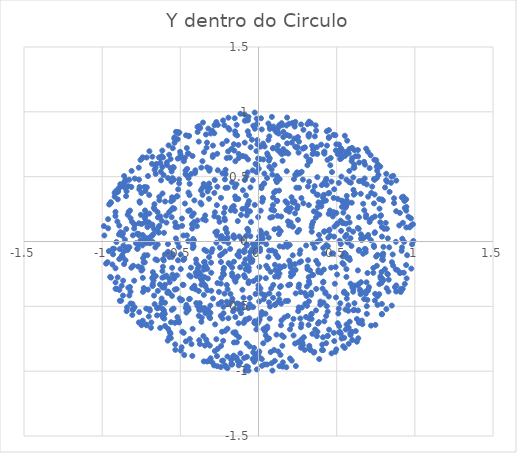
| Category | Y dentro do Circulo |
|---|---|
| 0.0 | 0 |
| 0.5824913958309657 | 0.147 |
| -0.10274675420012946 | -0.372 |
| 0.3691181538297885 | -0.149 |
| 0.28324670696125986 | -0.799 |
| -0.22171421234348498 | 0.003 |
| 0.34918489653656937 | 0.389 |
| -0.17051188895530744 | -0.459 |
| 0.0 | 0 |
| -0.2822801752314581 | 0.375 |
| 0.0 | 0 |
| -0.8305976686521073 | 0.227 |
| -0.8409951767035069 | -0.507 |
| -0.807322820931881 | -0.567 |
| 0.32517920160419833 | -0.822 |
| 0.3483666643932861 | 0.15 |
| 0.18859269846408022 | 0.155 |
| 0.41249743487753876 | -0.739 |
| -0.7141899433687766 | 0.418 |
| 0.0 | 0 |
| 0.3759309111390634 | 0.675 |
| 0.0 | 0 |
| 0.6491729342163812 | -0.372 |
| -0.08356164736692451 | -0.138 |
| 0.0 | 0 |
| 0.0 | 0 |
| 0.48222065649139334 | -0.704 |
| 0.6133080096440979 | 0.569 |
| 0.0 | 0 |
| 0.2035934603628089 | -0.182 |
| -0.5369673955765399 | 0.804 |
| 0.8786831464304732 | -0.002 |
| 0.0 | 0 |
| 0.2591799225699525 | 0.77 |
| -0.013596083525351244 | -0.678 |
| 0.5504688796966977 | -0.089 |
| -0.12651882503492629 | 0.644 |
| 0.0 | 0 |
| 0.11070303346926358 | -0.098 |
| -0.07887533704441974 | 0.043 |
| -0.3742973551315738 | -0.51 |
| -0.4843319749107293 | -0.334 |
| 0.0725126760214021 | 0.868 |
| -0.07067640993851287 | 0.098 |
| 0.5370403599780624 | -0.166 |
| 0.605317040131907 | 0.076 |
| -0.12514234186607442 | -0.738 |
| -0.08646866079407567 | -0.275 |
| 0.0 | 0 |
| 0.0 | 0 |
| 0.38011067176742674 | 0.36 |
| 0.0 | 0 |
| 0.0 | 0 |
| 0.8503405297641415 | 0.5 |
| 0.0 | 0 |
| 0.774221274463414 | 0.253 |
| -0.3162615292680615 | -0.12 |
| -0.48768610515749744 | -0.696 |
| -0.9549618778805946 | 0.285 |
| -0.3579383095247284 | 0.36 |
| -0.5499325939312683 | -0.255 |
| -0.5327327922374776 | -0.793 |
| -0.3388243723242108 | -0.553 |
| 0.6434961169008853 | -0.326 |
| 0.10183523932162242 | 0.095 |
| -0.5627692674530562 | -0.71 |
| -0.6340711962837107 | 0.122 |
| 0.15835578605192557 | 0.712 |
| -0.025094971917935638 | -0.08 |
| 0.0 | 0 |
| -0.9487728963605064 | -0.273 |
| 0.6853964652447091 | -0.061 |
| 0.337240819925559 | 0.911 |
| 0.0 | 0 |
| -0.7928095482513646 | -0.507 |
| -0.2926758793260462 | 0.652 |
| -0.6639568523584924 | 0.248 |
| -0.5971916382437978 | 0.308 |
| 0.0 | 0 |
| -0.15849107907487747 | 0.274 |
| 0.007335839017932777 | -0.895 |
| 0.0 | 0 |
| -0.7543966712906305 | 0.629 |
| -0.84393747633777 | 0.387 |
| -0.10287083286972387 | 0.252 |
| 0.0 | 0 |
| -0.6434490514446245 | 0.186 |
| 0.1392276410030775 | 0.686 |
| 0.027044977451173846 | 0.024 |
| 0.48063971328940847 | 0.336 |
| -0.32096948367387856 | 0.871 |
| 0.5264749523966377 | -0.019 |
| -0.679641614383711 | 0.045 |
| 0.0 | 0 |
| 0.06955037132103636 | -0.401 |
| 0.6765241224971563 | 0.241 |
| 0.7628542961505342 | 0.595 |
| 0.24908498842640525 | 0.073 |
| -0.6144139100303507 | -0.354 |
| 0.9223219745454649 | -0.365 |
| 0.3246211734815636 | 0.83 |
| 0.0 | 0 |
| 0.5193859741150035 | 0.707 |
| 0.28732604027799913 | 0.862 |
| 0.25016039747670815 | 0.274 |
| -0.02397805202246972 | 0.282 |
| -0.06164986680811246 | 0.312 |
| 0.9672042898750175 | 0.11 |
| -0.6225131078402659 | 0.647 |
| 0.49779177937294516 | 0.749 |
| -0.056129465928743016 | -0.436 |
| 0.7523059521893796 | -0.116 |
| -0.5607057680837213 | -0.745 |
| 0.4019824148962772 | 0.271 |
| -0.6112983400584597 | -0.587 |
| 0.0 | 0 |
| -0.6682483755685384 | -0.417 |
| 0.0 | 0 |
| 0.6070887278583763 | 0.398 |
| 0.0 | 0 |
| -0.46722693092133905 | 0.52 |
| 0.12222496752826828 | 0.198 |
| -0.3227080197566423 | -0.526 |
| -0.644663355965515 | -0.023 |
| -0.8185900556492052 | -0.478 |
| 0.23706140394374398 | -0.219 |
| 0.0065282399922172996 | -0.604 |
| -0.2399216684978842 | 0.337 |
| 0.931393501804419 | -0.003 |
| -0.8187582792241554 | -0.387 |
| 0.9095538126255538 | -0.365 |
| 0.3213492444182797 | 0.622 |
| -0.03455759665608826 | -0.506 |
| -0.24049605730190038 | 0.019 |
| 0.3392455855923253 | -0.597 |
| -0.6884425320386056 | 0.039 |
| 0.0 | 0 |
| -0.9434504935046404 | -0.279 |
| 0.0 | 0 |
| 0.0 | 0 |
| 0.5998275015271133 | -0.76 |
| 0.0 | 0 |
| 0.13519273978273816 | 0.481 |
| 0.12052299914682107 | 0.852 |
| 0.9779735240312586 | 0.124 |
| 0.09918770123905762 | 0.377 |
| 0.0 | 0 |
| 0.3288674930298563 | 0.618 |
| 0.0 | 0 |
| -0.9001491364631893 | 0.325 |
| -0.18537386581072024 | 0.863 |
| -0.23995120559009697 | -0.158 |
| 0.451535298446041 | -0.68 |
| -0.196624817689794 | 0.03 |
| 0.6886809534170801 | 0.716 |
| 0.0 | 0 |
| 0.0 | 0 |
| 0.24442729332645574 | 0.723 |
| 0.6911699122497048 | -0.315 |
| -0.26408078939681534 | 0.677 |
| 0.0671436912845973 | -0.47 |
| 0.6428291871940137 | -0.627 |
| -0.2692355782676239 | -0.009 |
| -0.31139358364841807 | -0.803 |
| 0.12802554547599998 | 0.879 |
| 0.5645171030428493 | 0.352 |
| 0.34202270434055726 | 0.131 |
| 0.0 | 0 |
| -0.018605640688908798 | -0.405 |
| -0.508479818435418 | -0.041 |
| 0.0 | 0 |
| 0.5607188551289555 | 0.27 |
| 0.0 | 0 |
| 0.7392888823988266 | -0.042 |
| 0.7912500699481027 | -0.291 |
| 0.14347353402208074 | -0.201 |
| 0.1901328270645204 | -0.337 |
| 0.0 | 0 |
| -0.2264643220439313 | 0.934 |
| -0.10397407882778542 | -0.486 |
| 0.0 | 0 |
| 0.5161769654218562 | -0.652 |
| -0.714838778170577 | 0.026 |
| 0.0 | 0 |
| -0.5781639886121681 | -0.674 |
| 0.0 | 0 |
| -0.07442731055949325 | -0.032 |
| -0.5625485123772633 | 0.566 |
| 0.018010504024617013 | 0.425 |
| 0.6556528250006752 | -0.314 |
| -0.2829043765458894 | 0.835 |
| 0.1906918157322941 | 0.257 |
| 0.5946525438108017 | -0.035 |
| 0.0 | 0 |
| -0.24935849936521115 | 0.152 |
| 0.13384458981056313 | -0.191 |
| -0.1624010349360634 | -0.538 |
| 0.2594673143501689 | 0.415 |
| -0.35723300157250315 | 0.417 |
| 0.0 | 0 |
| -0.6732113250777163 | 0.056 |
| 0.10431770209608238 | -0.921 |
| 0.36245919303719165 | -0.678 |
| -0.23347280489787114 | -0.696 |
| 0.7445196958170881 | -0.455 |
| -0.13976427917595502 | 0.9 |
| 0.5501256382620054 | 0.297 |
| 0.0 | 0 |
| 0.5766420871084792 | -0.665 |
| 0.6144220996514456 | -0.34 |
| -0.4194581313955146 | -0.021 |
| 0.4839990497905635 | 0.403 |
| 0.0 | 0 |
| -0.9202188721372699 | 0.346 |
| 0.0 | 0 |
| -0.011689824209191624 | 0.948 |
| -0.12268185255907538 | 0.039 |
| 0.22830328036528713 | 0.3 |
| -0.9304335420511718 | -0.099 |
| 0.7887476707398404 | 0.324 |
| 0.05578128912235103 | 0.679 |
| -0.22430116760598873 | -0.217 |
| -0.580737151648199 | -0.765 |
| 0.0 | 0 |
| -0.2946853378801346 | -0.059 |
| 0.2705757992186051 | -0.39 |
| 0.0 | 0 |
| -0.5483033725637936 | 0.719 |
| -0.2309277340627165 | 0.526 |
| 0.26763823163209755 | -0.068 |
| -0.3496991548153281 | -0.925 |
| -0.6603822474589898 | 0.59 |
| 0.0 | 0 |
| -0.0698644378154134 | 0.233 |
| 0.3737069653313092 | -0.73 |
| 0.450553515396368 | 0.859 |
| 0.0 | 0 |
| -0.2968110670327857 | 0.855 |
| 0.06281954808112844 | -0.119 |
| 0.0 | 0 |
| 0.017060272858139935 | -0.568 |
| 0.0 | 0 |
| 0.054826416026197755 | -0.948 |
| -0.07549742641571888 | 0.201 |
| -0.478311113203332 | -0.704 |
| 0.3803870880035145 | -0.632 |
| -0.5554818626110618 | 0.54 |
| 0.2900805465123837 | -0.738 |
| 0.06649458621219528 | 0.623 |
| 0.6757269296818118 | -0.444 |
| 0.0 | 0 |
| 0.2639261775617223 | 0.525 |
| -0.5165326708203313 | 0.639 |
| 0.10495543217363124 | -0.18 |
| 0.3214107423599455 | 0.809 |
| -0.49671073332258664 | 0.651 |
| 0.0 | 0 |
| -0.6943480946299625 | -0.013 |
| -0.4708747324666209 | 0.645 |
| 0.5458575157610892 | -0.394 |
| 0.08562373009985147 | 0.961 |
| 0.0 | 0 |
| 0.3686443207582488 | 0.855 |
| 0.0 | 0 |
| 0.22986935191350089 | 0.309 |
| 0.0 | 0 |
| -0.7488652462294276 | -0.224 |
| 0.07759778563582631 | -0.234 |
| 0.224346072792458 | -0.223 |
| 0.8198929346093782 | -0.361 |
| -0.9202124546339121 | 0.375 |
| 0.2079567493694925 | 0.257 |
| -0.026810369041211368 | -0.928 |
| -0.06431430367879942 | 0.961 |
| -0.19809822876411576 | -0.673 |
| 0.0 | 0 |
| 0.4190575745657501 | 0.446 |
| -0.6716309753937462 | -0.269 |
| 0.727444432194251 | 0.423 |
| 0.4281005063936456 | -0.4 |
| 0.0 | 0 |
| 0.7344931720199659 | -0.242 |
| 0.915600670959843 | -0.072 |
| 0.20509395053335688 | -0.169 |
| 0.1727975273506297 | 0.31 |
| -0.2176779495979173 | 0.179 |
| -0.497423015775468 | -0.842 |
| 0.0 | 0 |
| 0.0 | 0 |
| 0.07524499944177232 | 0.184 |
| 0.7371065584287153 | -0.03 |
| 0.9460015939803528 | 0.267 |
| -0.4127672460320151 | 0.008 |
| -0.052007279152955554 | 0.04 |
| 0.6381902579454499 | -0.746 |
| 0.5160086455489594 | -0.701 |
| 0.18258281063282777 | 0.821 |
| -0.46452640796397393 | -0.77 |
| 0.5419626638884651 | -0.111 |
| -0.8659261820476392 | -0.302 |
| -0.028636277071916405 | -0.821 |
| 0.037573366952292186 | 0.524 |
| -0.018822262862190353 | 0.599 |
| 0.0 | 0 |
| 0.0 | 0 |
| -0.06797983374595762 | -0.967 |
| 0.5426676343579451 | 0.223 |
| 0.2269011609570597 | 0.481 |
| -0.8547575150830544 | 0.014 |
| -0.17282585071317902 | 0.715 |
| -0.03673315877145722 | -0.018 |
| 0.8213577180703591 | 0.098 |
| -0.30615980941740295 | 0.833 |
| -0.12660555957938446 | -0.955 |
| 0.0 | 0 |
| 0.4523563187174098 | 0.374 |
| 0.9345296316271341 | 0.313 |
| 0.5074685786038788 | 0.329 |
| 0.0 | 0 |
| 0.1239298548704475 | 0.741 |
| 0.7344037586584227 | -0.204 |
| 0.7427958585964567 | 0.362 |
| 0.8524254471968253 | -0.494 |
| 0.0 | 0 |
| 0.0 | 0 |
| 0.5633229943393006 | -0.64 |
| -0.17738671148250895 | 0.24 |
| -0.30803366184432335 | -0.494 |
| 0.49321984940471353 | -0.197 |
| 0.060309910490006 | 0.663 |
| -0.8874559105107824 | -0.059 |
| 0.0 | 0 |
| -0.1270927268009543 | -0.482 |
| 0.04618118730545451 | -0.724 |
| 0.0 | 0 |
| 0.45433612602059004 | 0.091 |
| 0.0 | 0 |
| 0.0 | 0 |
| -0.22691173068752546 | -0.246 |
| -0.5325146382619739 | 0.146 |
| 0.09458126631659902 | -0.335 |
| -0.13587034885404958 | -0.478 |
| 0.0 | 0 |
| -0.6875923388386644 | -0.665 |
| 0.42076148062109686 | 0.075 |
| -0.7481302461303698 | -0.646 |
| 0.0 | 0 |
| 0.6930985936712546 | -0.558 |
| 0.6293702196292907 | -0.773 |
| -0.5127719457977851 | 0.835 |
| 0.15935546166166947 | 0.846 |
| 0.0 | 0 |
| 0.07787754782186895 | -0.852 |
| -0.3684355807670172 | 0.395 |
| -0.06484823909015947 | -0.513 |
| -0.8130724242601941 | 0.42 |
| -0.6337285327451174 | -0.509 |
| -0.4585655392053438 | 0.721 |
| 0.0 | 0 |
| -0.3820039722494506 | -0.574 |
| 0.7122922570455443 | 0.167 |
| -0.37909804392776447 | -0.761 |
| 0.46711184983196996 | -0.863 |
| -0.5284415443440114 | 0.024 |
| 0.5647371145059599 | -0.44 |
| 0.0 | 0 |
| -0.864191074651927 | -0.032 |
| -0.4234692476430755 | -0.883 |
| 0.3806789046340546 | 0.266 |
| -0.2654975295382298 | -0.884 |
| 0.6810325001495825 | 0.593 |
| -0.6478842505873377 | -0.145 |
| -0.3980196345465232 | -0.475 |
| -0.7010170007467711 | 0.148 |
| 0.0 | 0 |
| -0.6046185616760307 | -0.534 |
| 0.0 | 0 |
| -0.14793562854792253 | -0.583 |
| -0.7385028746476641 | -0.389 |
| 0.36030916943281044 | 0.811 |
| -0.6185500525799348 | 0.16 |
| 0.0 | 0 |
| -0.552036204843904 | -0.118 |
| 0.4583288745370866 | 0.045 |
| -0.3277620371791312 | -0.21 |
| -0.1410113447398489 | 0.441 |
| -0.696651907510341 | -0.522 |
| -0.21473586282756818 | 0.479 |
| 0.03898251097829819 | 0.733 |
| 0.0 | 0 |
| 0.08679694997348641 | -0.069 |
| -0.16790113059617306 | -0.201 |
| -0.6100470774312334 | -0.136 |
| 0.0 | 0 |
| 0.11707365428985406 | 0.313 |
| 0.4331742316871796 | 0.484 |
| -0.8722483078549366 | 0.045 |
| -0.7151412271483215 | 0.648 |
| 0.4957602177405971 | -0.431 |
| 0.005109518867287388 | -0.848 |
| 0.25942408467471556 | -0.332 |
| 0.0 | 0 |
| -0.2093338213628413 | 0.103 |
| -0.2822913652190515 | 0.194 |
| -0.5861592426983562 | 0.59 |
| 0.0 | 0 |
| -0.39011823382729793 | 0.884 |
| -0.8505556389148703 | -0.145 |
| 0.0 | 0 |
| -0.42144306143288457 | -0.674 |
| 0.3365999491761502 | -0.395 |
| -0.47501976072936447 | -0.876 |
| 0.02080178364996521 | -0.907 |
| 0.5135923078918738 | 0.452 |
| 0.08864971734271232 | 0.247 |
| 0.0 | 0 |
| 0.0 | 0 |
| 0.0 | 0 |
| 0.8809456065040027 | 0.233 |
| 0.0 | 0 |
| -0.643945417712916 | -0.381 |
| 0.0 | 0 |
| 0.5339391496887291 | 0.267 |
| 0.33710206002895315 | -0.412 |
| -0.5423835675071353 | 0.476 |
| 0.0 | 0 |
| 0.0 | 0 |
| -0.8011050077965076 | -0.524 |
| 0.7560662212932792 | 0.576 |
| 0.0 | 0 |
| 0.0 | 0 |
| 0.0 | 0 |
| 0.0 | 0 |
| -0.24130981529653783 | -0.574 |
| 0.48459687416422303 | -0.768 |
| 0.1780002403859744 | -0.97 |
| 0.6695412129194047 | 0.291 |
| 0.0 | 0 |
| 0.13400218685692367 | -0.961 |
| 0.45069236185182127 | 0.805 |
| -0.9149341594329234 | 0.228 |
| 0.2690384377794166 | -0.764 |
| -0.050406600690413805 | -0.142 |
| -0.3797732677521397 | -0.527 |
| 0.0 | 0 |
| 0.0 | 0 |
| 0.0 | 0 |
| -0.3523781992580197 | -0.73 |
| -0.45007245487133885 | 0.003 |
| 0.0 | 0 |
| 0.0 | 0 |
| -0.6794670495904724 | -0.282 |
| -0.34274299025393073 | -0.803 |
| 0.21697012811349947 | -0.251 |
| -0.4100254492871169 | -0.341 |
| -0.5223133305880476 | 0.349 |
| 0.22098926023153842 | -0.251 |
| -0.4647422052399919 | -0.513 |
| 0.2599609711234152 | 0.09 |
| 0.0 | 0 |
| 0.11526587278683653 | 0.842 |
| 0.0 | 0 |
| 0.79777127970542 | -0.093 |
| 0.0 | 0 |
| 0.0 | 0 |
| 0.09392187394195028 | 0.721 |
| -0.8904054889866451 | -0.136 |
| 0.6859856131122237 | -0.403 |
| 0.31266214088396205 | -0.193 |
| -0.3550095245208349 | 0.918 |
| -0.14676761083525935 | -0.898 |
| -0.5988822636954076 | -0.1 |
| 0.6001436598367629 | -0.353 |
| 0.0 | 0 |
| -0.15883163546562518 | 0.04 |
| 0.0 | 0 |
| 0.7788843911610683 | 0.578 |
| 0.010084864430043083 | -0.053 |
| -0.08771337516425359 | 0.979 |
| -0.8510403843823582 | 0.464 |
| 0.016260131769739283 | 0.416 |
| 0.2420788396218816 | 0.794 |
| -0.7105797660154556 | -0.106 |
| 0.0 | 0 |
| -0.1689721287207937 | 0.456 |
| -0.40640928426058176 | 0.528 |
| -0.22109852877908187 | 0.221 |
| -0.37005181827748834 | -0.253 |
| 0.3961286464252758 | -0.463 |
| 0.07324563953063756 | -0.501 |
| -0.9450105785386906 | 0.303 |
| 0.0 | 0 |
| 0.919725724746443 | 0.021 |
| -0.7913304677095401 | 0.485 |
| 0.5450461551028145 | -0.177 |
| -0.08811235112454785 | 0.763 |
| 0.0 | 0 |
| 0.4427013065641059 | -0.541 |
| -0.5681646125158022 | -0.314 |
| -0.571844300997675 | -0.285 |
| 0.7620503213674241 | -0.422 |
| 0.7948954854764669 | -0.113 |
| 0.0 | 0 |
| 0.18071026134127077 | 0.542 |
| -0.31660640591530975 | -0.922 |
| 0.5259761480981928 | 0.679 |
| -0.8609942539578164 | 0.434 |
| 0.12305023809821813 | -0.249 |
| -0.43948070338586387 | 0.24 |
| 0.0 | 0 |
| 0.0 | 0 |
| -0.13880207660723531 | -0.777 |
| 0.8033876525174837 | 0.098 |
| -0.15677807066478877 | -0.156 |
| 0.6299148318297043 | -0.598 |
| 0.5219083419720381 | 0.69 |
| 0.0 | 0 |
| 0.0 | 0 |
| 0.21179935284190798 | -0.642 |
| 0.0 | 0 |
| -0.0005174325531944746 | -0.338 |
| 0.0 | 0 |
| -0.9621619892250364 | 0.172 |
| -0.7236531415024388 | 0.389 |
| -0.15717564523069516 | -0.779 |
| -0.8869004441292558 | -0.458 |
| 0.0 | 0 |
| 0.5670072679665032 | -0.127 |
| -0.6138905210131422 | 0.37 |
| -0.06867506311998506 | 0.289 |
| 0.2341428427593506 | -0.787 |
| -0.5022016481249132 | 0.647 |
| -0.18164157056874064 | -0.179 |
| -0.14724640219664753 | -0.7 |
| 0.0 | 0 |
| 0.0 | 0 |
| -0.8669541665038705 | 0.064 |
| -0.7402148473968939 | -0.611 |
| -0.41711150345104975 | 0.007 |
| 0.0 | 0 |
| -0.9237257752951376 | -0.056 |
| 0.0 | 0 |
| 0.0 | 0 |
| 0.3679121624139905 | 0.226 |
| -0.18680477107283178 | -0.483 |
| 0.9881072289295734 | 0.133 |
| -0.036707123320436574 | 0.473 |
| 0.0 | 0 |
| 0.8480038993458421 | 0.453 |
| 0.7568337708159603 | 0.49 |
| -0.9145002690745421 | -0.365 |
| 0.0 | 0 |
| -0.20550882664268566 | -0.971 |
| 0.40933786150386275 | -0.363 |
| -0.3466567378035932 | -0.196 |
| -0.7290718114365096 | -0.106 |
| -0.5169336538050762 | 0.789 |
| -0.07020761634765993 | -0.186 |
| 0.779232503330842 | 0.148 |
| -0.735143350504692 | 0.018 |
| 0.21148432049693477 | 0.341 |
| 0.05486818178950936 | 0.49 |
| -0.32946612297354383 | 0.763 |
| 0.2712962102504288 | -0.819 |
| -0.9025665249635069 | 0.154 |
| -0.011443323840324204 | -0.64 |
| 0.0 | 0 |
| 0.0 | 0 |
| -0.6978038028952462 | 0.696 |
| 0.0 | 0 |
| 0.42134505054122817 | 0.455 |
| -0.5158924415501984 | 0.844 |
| 0.538547668531344 | 0.306 |
| 0.23500806047091016 | 0.515 |
| -0.12357407302215218 | -0.116 |
| 0.6129991275785933 | -0.527 |
| -0.7482367381643342 | 0.135 |
| 0.09164960701089564 | 0.719 |
| -0.5711576949306632 | 0.669 |
| 0.0378760776626319 | -0.948 |
| -0.07728631248121509 | 0.501 |
| 0.0 | 0 |
| -0.07387884921342058 | -0.889 |
| 0.0 | 0 |
| -0.8368553510880476 | -0.065 |
| -0.51217127390386 | -0.607 |
| 0.0 | 0 |
| -0.1928945449945043 | 0.875 |
| 0.3601830753140829 | 0.68 |
| -0.22074815691516436 | -0.255 |
| 0.24232287362288796 | 0.415 |
| 0.0 | 0 |
| -0.021348883184223677 | -0.043 |
| -0.9892003851600837 | 0.119 |
| -0.9316152479386002 | -0.056 |
| -0.6674822045023785 | 0.095 |
| 0.5627312187956937 | 0.052 |
| 0.3309930237454939 | -0.588 |
| 0.6613252262323221 | -0.61 |
| 0.0 | 0 |
| -0.11594393815959148 | -0.863 |
| 0.19556504180280854 | 0.124 |
| -0.08948158828959918 | -0.065 |
| 0.0 | 0 |
| -0.9144032196506608 | -0.316 |
| 0.0 | 0 |
| 0.17177622447550722 | 0.684 |
| -0.5150028404813136 | -0.145 |
| 0.0 | 0 |
| 0.0 | 0 |
| 0.0 | 0 |
| -0.3143544166185017 | 0.546 |
| -0.8929680612767708 | 0.054 |
| 0.0 | 0 |
| 0.7888213006245504 | -0.561 |
| 0.6927669460239305 | -0.499 |
| 0.019186229750277617 | 0.412 |
| 0.0 | 0 |
| 0.23297472316979384 | -0.175 |
| -0.4550150420172667 | 0.504 |
| 0.0 | 0 |
| 0.016136829299628452 | 0.95 |
| -0.41014073359855563 | 0.317 |
| -0.8501936063399427 | 0.476 |
| -0.21068005909550136 | 0.553 |
| 0.4668993303880007 | 0.462 |
| 0.0 | 0 |
| -0.3021906825777827 | -0.241 |
| 0.0 | 0 |
| -0.4393977512309153 | -0.442 |
| -0.06209689986001177 | -0.226 |
| -0.18104214035893307 | -0.057 |
| 0.464354344782409 | -0.202 |
| 0.0 | 0 |
| -0.5461507601316169 | 0.573 |
| 0.23380023840410424 | 0.217 |
| 0.11757316411706631 | 0.458 |
| 0.7905290613231455 | -0.138 |
| 0.3490313603282449 | -0.258 |
| 0.5029119091410574 | -0.255 |
| 0.6129695649582276 | 0.705 |
| 0.0 | 0 |
| 0.7388170707605144 | 0.294 |
| 0.1469993696836034 | -0.609 |
| 0.0 | 0 |
| -0.42373912791282176 | -0.359 |
| 0.4060936903909276 | -0.837 |
| -0.5319297496203834 | -0.836 |
| 0.2741144471137016 | -0.638 |
| -0.4257530501537905 | 0.132 |
| 0.3048548116418044 | -0.031 |
| 0.38379201893222614 | 0.302 |
| 0.8885997751112134 | -0.22 |
| -0.554316082728215 | -0.528 |
| 0.6358855996901813 | -0.223 |
| -0.39383272242527 | 0.118 |
| 0.813858908494814 | 0.144 |
| -0.6194040446138531 | 0.657 |
| -0.311902521908511 | 0.414 |
| -0.09089615154348296 | -0.62 |
| 0.44351903227973577 | -0.728 |
| -0.4977250319928057 | -0.101 |
| 0.21472286917499828 | -0.242 |
| 0.25617520904241253 | 0.685 |
| 0.0 | 0 |
| 0.0 | 0 |
| 0.0 | 0 |
| 0.6427611748849296 | -0.065 |
| -0.4969822882893884 | -0.213 |
| 0.0 | 0 |
| 0.04935288216916289 | -0.021 |
| 0.4753702897288865 | 0.194 |
| -0.15584586049832572 | 0.027 |
| -0.4802687863435764 | -0.143 |
| 0.0 | 0 |
| 0.2184744010530837 | 0.307 |
| 0.5211746371243391 | -0.697 |
| 0.0 | 0 |
| -0.8630184156650051 | -0.079 |
| 0.01551655347164127 | 0.072 |
| -0.3414425247596513 | -0.539 |
| 0.0 | 0 |
| -0.752372670975096 | 0.206 |
| -0.09245973452141953 | -0.17 |
| 0.14075999860350263 | -0.875 |
| 0.0 | 0 |
| 0.2712250997992134 | -0.662 |
| 0.23150196636564413 | 0.886 |
| 0.9005119692752708 | 0.124 |
| 0.0 | 0 |
| -0.19124459953416717 | -0.167 |
| 0.0 | 0 |
| -0.25711200076754026 | 0.183 |
| 0.2675922189328397 | -0.594 |
| 0.7069141244315122 | -0.352 |
| 0.0 | 0 |
| -0.7428480850142114 | 0.643 |
| -0.16892623285400798 | 0.262 |
| -0.21717133005994205 | -0.402 |
| -0.2775303601877599 | -0.639 |
| 0.44985391338196656 | 0.799 |
| 0.5065556885934128 | 0.674 |
| -0.5551142726492551 | 0.188 |
| -0.44395429669949227 | -0.444 |
| 0.0 | 0 |
| 0.0 | 0 |
| -0.7629286881628974 | -0.545 |
| 0.0 | 0 |
| -0.054592588229680716 | 0.233 |
| -0.8692509612953956 | -0.117 |
| 0.833057358009581 | -0.295 |
| -0.033171665520645766 | 0.893 |
| 0.3728856806415528 | 0.727 |
| 0.15866478361815806 | 0.805 |
| -0.15504834714157978 | 0.701 |
| -0.04816678988236878 | 0.15 |
| 0.5964511711144105 | 0.299 |
| -0.303476921122495 | -0.163 |
| 0.9773477377844828 | -0.209 |
| 0.33007930082826054 | -0.833 |
| -0.6885214873538494 | -0.003 |
| 0.7931379389070288 | -0.288 |
| -0.3376462205757902 | 0.163 |
| -0.8704512321772511 | -0.12 |
| 0.1289510061151622 | -0.406 |
| 0.5615215794514501 | 0.288 |
| 0.20568412887029175 | -0.197 |
| 0.0 | 0 |
| 0.0 | 0 |
| -0.811677057898216 | 0.545 |
| 0.6432105421633132 | 0.465 |
| 0.4499877016032201 | 0.084 |
| 0.0 | 0 |
| -0.9749096892776401 | -0.17 |
| 0.4079262124726779 | -0.795 |
| 0.0 | 0 |
| -0.05011018080099894 | 0.727 |
| 0.0 | 0 |
| 0.16127743082193313 | -0.736 |
| 0.8361098409581329 | -0.045 |
| -0.26039713864297687 | 0.549 |
| 0.0 | 0 |
| -0.914582723210422 | -0.206 |
| 0.97488534074191 | 0.179 |
| 0.8670071056059538 | 0.333 |
| -0.4319960592200913 | -0.202 |
| -0.3255174033444517 | 0.386 |
| -0.11168132289013033 | 0.205 |
| 0.3128365506746553 | 0.588 |
| -0.678760582626744 | 0.654 |
| 0.4414851792371719 | 0.63 |
| -0.16930010262895911 | -0.947 |
| 0.7959352241926165 | 0.316 |
| 0.0 | 0 |
| 0.0 | 0 |
| 0.1831298860546704 | 0.757 |
| 0.5255989519396707 | 0.16 |
| 0.13371914958708908 | -0.447 |
| 0.0 | 0 |
| -0.19857329114564948 | -0.887 |
| 0.43137613176015543 | 0.315 |
| 0.08400005977749858 | 0.556 |
| -0.6456908643404291 | 0.227 |
| 0.0 | 0 |
| 0.3312528621874784 | -0.836 |
| 0.25740510103659786 | -0.508 |
| 0.0 | 0 |
| -0.8364036639437324 | 0.206 |
| 0.5417502699742962 | -0.808 |
| 0.2837858497352952 | 0.477 |
| -0.4522479004560356 | 0.679 |
| -0.12190192848211079 | -0.076 |
| -0.5185565214886152 | -0.008 |
| 0.21271609517285262 | 0.763 |
| 0.8727887363459894 | -0.352 |
| 0.0 | 0 |
| 0.3763769589223347 | 0.496 |
| 0.8781106314967801 | -0.216 |
| 0.6413447658299085 | 0.098 |
| 0.17834131284313615 | 0.242 |
| -0.6753415278895063 | -0.236 |
| 0.4981322571827287 | 0.22 |
| 0.6202817537452796 | 0.658 |
| 0.0 | 0 |
| 0.0 | 0 |
| -0.48846217814783777 | 0.121 |
| -0.8380344231209542 | -0.045 |
| -0.3971127294300143 | -0.168 |
| -0.40243006509931556 | -0.369 |
| -0.39954917797976286 | -0.139 |
| 0.8385241443867233 | 0.383 |
| -0.6148618138976598 | -0.228 |
| 0.3132122329832421 | -0.213 |
| -0.6645062075528851 | 0.553 |
| 0.10238170304938565 | 0.591 |
| -0.05614335047625474 | -0.118 |
| 0.0 | 0 |
| 0.0 | 0 |
| 0.0 | 0 |
| -0.6111381634600246 | -0.195 |
| -0.34103929901878405 | 0.201 |
| 0.055812620863866735 | -0.756 |
| -0.6979527407890076 | 0.216 |
| -0.09975893793426427 | 0.396 |
| 0.1525567907155594 | -0.805 |
| -0.0944764366390336 | -0.628 |
| -0.5526836359650011 | -0.203 |
| -0.9505101153948379 | 0.291 |
| 0.4049011059005352 | 0.435 |
| 0.0 | 0 |
| 0.11500047420038118 | -0.719 |
| 0.0 | 0 |
| 0.0 | 0 |
| 0.0 | 0 |
| -0.1452429326127116 | 0.327 |
| 0.6417671163737724 | -0.071 |
| -0.3360408800197363 | 0.825 |
| 0.0 | 0 |
| -0.7654549175198844 | -0.624 |
| 0.0 | 0 |
| 0.0 | 0 |
| 0.9356867006118146 | -0.328 |
| -0.48035823515179454 | 0.046 |
| 0.00951929689600961 | -0.073 |
| -0.3818846200130992 | -0.382 |
| -0.44646775986671794 | 0.811 |
| 0.0 | 0 |
| 0.4198312865181586 | 0.685 |
| -0.5697014418642006 | -0.399 |
| 0.4151307038746743 | -0.31 |
| 0.0 | 0 |
| -0.5532269270701609 | -0.42 |
| 0.2825137064315706 | 0.716 |
| 0.7794079781698 | -0.269 |
| -0.1938526497182338 | -0.011 |
| -0.809309543381266 | 0.152 |
| 0.9443244824642689 | -0.182 |
| 0.6746624283561757 | 0.031 |
| 0.418839610810271 | -0.094 |
| -0.38935534882275724 | 0.845 |
| -0.1581019339062273 | -0.881 |
| -0.33217059095488 | 0.724 |
| -0.6122405942438369 | -0.521 |
| 0.7015477065767817 | 0.05 |
| 0.7476658699019489 | -0.643 |
| -0.007670071567888126 | 0.782 |
| -0.5387579803813725 | 0.794 |
| 0.0 | 0 |
| -0.14704840049380508 | 0.825 |
| 0.9507975923620124 | -0.106 |
| -0.707635249275895 | -0.371 |
| -0.659793318241348 | -0.045 |
| 0.07311149926482274 | 0.887 |
| 0.7979787727876899 | -0.3 |
| 0.0 | 0 |
| -0.6248286458588628 | 0.538 |
| -0.2644990514117169 | -0.961 |
| -0.26629403690075626 | 0.281 |
| 0.617110758585713 | 0.372 |
| -0.20270525813885154 | -0.464 |
| -0.46374409766660696 | 0.819 |
| 0.0 | 0 |
| 0.37715749170254176 | -0.696 |
| 0.7108198785450379 | 0.566 |
| 0.005223741779035063 | -0.597 |
| -0.2600042419866848 | 0.899 |
| -0.14891240087397994 | 0.348 |
| -0.19800266776419795 | -0.977 |
| -0.9344168318353527 | -0.177 |
| 0.6754050171153825 | 0.614 |
| 0.02966578705511247 | 0.755 |
| -0.8015121849550197 | -0.187 |
| -0.7694435206965113 | -0.193 |
| 0.0 | 0 |
| -0.6279461100438928 | 0.642 |
| 0.20518148297317906 | 0.146 |
| -0.023950203030791872 | -0.614 |
| 0.5336887858877266 | 0.646 |
| 0.7438557838545976 | 0.193 |
| 0.7109762117169462 | 0.15 |
| -0.2913141201126608 | 0.74 |
| -0.23685118462576815 | -0.467 |
| -0.02421663404357921 | -0.622 |
| 0.0 | 0 |
| 0.0 | 0 |
| -0.5149179069478482 | 0.112 |
| 0.0 | 0 |
| -0.3540603719973412 | 0.171 |
| 0.0 | 0 |
| -0.017665580795609204 | -0.908 |
| 0.8312864423477153 | -0.386 |
| 0.031786754152338004 | -0.676 |
| 0.40045062545525134 | -0.24 |
| 0.18526939798563524 | -0.041 |
| 0.0 | 0 |
| 0.0 | 0 |
| -0.8789597444037316 | 0.424 |
| -0.1791404815254427 | -0.405 |
| 0.5743975326930595 | -0.534 |
| 0.0 | 0 |
| 0.0 | 0 |
| 0.5346007964353432 | 0.703 |
| 0.8811811290319425 | 0.47 |
| 0.0 | 0 |
| 0.5672945078957521 | 0.778 |
| -0.15756835870302166 | 0.75 |
| 0.14513557725345194 | 0.193 |
| -0.628892638564073 | -0.666 |
| 0.03322411999962216 | -0.445 |
| 0.0 | 0 |
| 0.0 | 0 |
| 0.028811970519756258 | 0.328 |
| -0.734724779429504 | -0.159 |
| 0.90565652582311 | -0.239 |
| 0.13522993955031315 | -0.037 |
| 0.201992185951003 | -0.902 |
| 0.0 | 0 |
| 0.0 | 0 |
| -0.003238773674678619 | 0.641 |
| -0.15221669568922613 | 0.951 |
| -0.8328274223111831 | -0.356 |
| -0.5276627263677129 | 0.845 |
| 0.0 | 0 |
| -0.7257046907890772 | 0.239 |
| -0.2788494412080129 | 0.225 |
| 0.0809456900544323 | -0.362 |
| 0.10633542118404127 | -0.489 |
| 0.0 | 0 |
| 0.3250083547150233 | -0.804 |
| -0.9058470298626444 | 0.381 |
| -0.05159773063948059 | 0.417 |
| -0.6024699120682291 | -0.594 |
| -0.7906534745265785 | 0.129 |
| 0.519461324715178 | 0.005 |
| 0.7721382508652552 | -0.406 |
| 0.8272117523180365 | 0.024 |
| 0.0 | 0 |
| 0.03861501828710012 | -0.419 |
| 0.5564608454182287 | -0.525 |
| -0.44117252049540223 | 0.357 |
| 0.6064668315337021 | 0.494 |
| 0.0 | 0 |
| 0.0 | 0 |
| 0.5726942337963805 | 0.297 |
| 0.12517556456337187 | -0.122 |
| 0.7411275010531277 | 0.631 |
| 0.7187720105144229 | 0.01 |
| -0.5074215693502642 | 0.449 |
| -0.2696146637085024 | -0.753 |
| 0.0 | 0 |
| -0.07012365271859378 | 0.282 |
| 0.6122578143723616 | 0.593 |
| -0.47056643247528984 | 0.293 |
| 0.7385453060491922 | 0.481 |
| 0.5833028169321699 | -0.618 |
| 0.701497482321991 | -0.369 |
| 0.7729959483517392 | -0.329 |
| 0.0 | 0 |
| 0.0 | 0 |
| 0.0 | 0 |
| 0.0 | 0 |
| 0.34467921487547826 | -0.712 |
| 0.27232228031458683 | -0.153 |
| 0.0 | 0 |
| -0.957037240987239 | -0.074 |
| -0.7344427174377233 | 0.016 |
| -0.3708909972934895 | 0.3 |
| -0.7270463809304628 | 0.18 |
| 0.0 | 0 |
| 0.5728934313306728 | 0.187 |
| 0.0 | 0 |
| -0.14322006989198188 | -0.719 |
| 0.04469813738500328 | -0.557 |
| -0.14366676230967323 | -0.286 |
| -0.46120635755396777 | -0.489 |
| 0.0 | 0 |
| 0.32127683098817106 | -0.275 |
| -0.21211452168097078 | -0.688 |
| 0.0 | 0 |
| 0.0 | 0 |
| 0.5223075645133513 | 0.636 |
| -0.7952614880856714 | 0.1 |
| 0.0 | 0 |
| 0.49761352156065963 | -0.832 |
| 0.02137260881577374 | -0.544 |
| -0.21130487358962302 | 0.414 |
| -0.30744902021988607 | -0.55 |
| 0.5316182622661334 | -0.748 |
| -0.5422272328738706 | 0.57 |
| 0.0 | 0 |
| -0.19251529017194047 | -0.592 |
| 0.0 | 0 |
| 0.5679243227976754 | -0.007 |
| 0.41075680450372287 | 0.305 |
| -0.26077214147618366 | -0.828 |
| 0.8177644053984012 | -0.521 |
| -0.3592208121034046 | -0.31 |
| -0.026262717243500155 | -0.628 |
| -0.7755745255078494 | 0.061 |
| -0.0827613875948745 | 0.654 |
| 0.0 | 0 |
| -0.16896449479596654 | -0.246 |
| -0.6989661369671016 | 0.358 |
| 0.06924205061279354 | 0.576 |
| 0.5530294072605635 | 0.66 |
| -0.44011215504971957 | 0.445 |
| 0.20737066208888333 | -0.268 |
| -0.6715395398595818 | -0.301 |
| 0.3128789467911057 | 0.905 |
| 0.0 | 0 |
| -0.7161662188852209 | -0.646 |
| 0.0 | 0 |
| 0.32547934617640895 | -0.596 |
| 0.580897327872191 | 0.713 |
| 0.41592865038732985 | -0.471 |
| 0.4204148998384405 | 0.079 |
| -0.05650706653667492 | -0.484 |
| 0.0 | 0 |
| 0.33741524812097423 | -0.562 |
| 0.0 | 0 |
| -0.590638347753099 | 0.199 |
| -0.4465337693618465 | 0.677 |
| 0.1339950782921615 | -0.247 |
| -0.2759930906944805 | 0.071 |
| 0.0 | 0 |
| 0.0 | 0 |
| 0.0 | 0 |
| 0.0 | 0 |
| -0.44436370791168933 | 0.815 |
| -0.14328764841564023 | -0.896 |
| -0.1830117114251666 | 0.647 |
| 0.06526119697478139 | 0.03 |
| 0.19641660247945247 | 0.909 |
| 0.0 | 0 |
| -0.5831881360766875 | -0.396 |
| 0.04706607847796773 | -0.283 |
| 0.0 | 0 |
| -0.33817129457954986 | -0.185 |
| -0.1526260102253172 | -0.295 |
| 0.24634127047066579 | 0.533 |
| -0.0007248284353491563 | -0.624 |
| 0.034882481785205144 | 0.445 |
| -0.5448180718034696 | 0.322 |
| 0.5887931747354636 | 0.025 |
| -0.2631864186807371 | 0.422 |
| 0.0 | 0 |
| 0.15588953560277363 | -0.932 |
| -0.3724705366385159 | 0.876 |
| 0.0 | 0 |
| 0.22002796398686475 | 0.114 |
| 0.0 | 0 |
| 0.9099884871528026 | -0.389 |
| 0.39362087342699237 | 0.01 |
| -0.07848064941172073 | 0.934 |
| -0.4918725096170957 | -0.816 |
| 0.38314294355809153 | -0.222 |
| 0.21769612679692485 | 0.915 |
| 0.0 | 0 |
| -0.7278941198561175 | 0.146 |
| -0.7606882744453247 | 0.421 |
| 0.18475657945044488 | 0.295 |
| 0.32029178026285865 | -0.644 |
| 0.656121115309519 | 0.024 |
| -0.06354743174020405 | 0.231 |
| 0.0 | 0 |
| -0.8836591811882879 | 0.442 |
| -0.2282051349227172 | 0.028 |
| 0.12631378988630004 | -0.848 |
| -0.0994326925287965 | 0.659 |
| -0.49859539200369407 | 0.67 |
| 0.06926798033054182 | 0.811 |
| -0.8783306942211335 | -0.457 |
| -0.380513522127256 | 0.889 |
| -0.8494801212677032 | 0.474 |
| 0.0 | 0 |
| 0.021359986763129557 | -0.001 |
| 0.1118228114199673 | 0.475 |
| -0.6489811353689048 | -0.57 |
| 0.0 | 0 |
| 0.0 | 0 |
| -0.312225153117649 | 0.563 |
| 0.44949176364083687 | -0.424 |
| 0.012323090388379976 | -0.362 |
| 0.9043967274276485 | 0.22 |
| 0.0 | 0 |
| -0.2184953738010713 | 0.897 |
| -0.3061736589721311 | -0.901 |
| 0.5801928768383153 | 0.458 |
| 0.21248706496966596 | -0.919 |
| 0.0 | 0 |
| -0.6020333075969084 | -0.272 |
| 0.0 | 0 |
| 0.5303197808131994 | 0.5 |
| 0.0 | 0 |
| -0.8739968709067947 | -0.109 |
| 0.0 | 0 |
| 0.15892839705445283 | -0.041 |
| 0.0 | 0 |
| 0.0 | 0 |
| -0.3797462137514973 | -0.238 |
| -0.19426323161784276 | 0.695 |
| 0.5598705268794963 | 0.276 |
| 0.0 | 0 |
| 0.5889254147499468 | -0.721 |
| 0.0 | 0 |
| -0.315217938255935 | -0.581 |
| 0.0 | 0 |
| -0.9039262573844915 | -0.366 |
| -0.34929131793726387 | -0.217 |
| 0.5991970289403921 | 0.642 |
| -0.24569987461703868 | -0.108 |
| 0.29749022976543804 | 0.726 |
| 0.0 | 0 |
| 0.0 | 0 |
| -0.07472886910053367 | -0.786 |
| 0.6965244758856144 | -0.451 |
| -0.20239558601183738 | 0.021 |
| -0.15924064906033242 | 0.047 |
| 0.5263408363934665 | -0.709 |
| -0.010425204811505218 | -0.987 |
| 0.0 | 0 |
| 0.38707793974499927 | 0.05 |
| -0.038987135727274635 | -0.142 |
| 0.2744365509948865 | 0.335 |
| 0.0 | 0 |
| 0.9821608312324943 | -0.021 |
| 0.8095312386351645 | 0.417 |
| 0.1051238766496505 | -0.486 |
| 0.3536990760183625 | -0.857 |
| -0.3455704744853165 | -0.275 |
| 0.7612077525367344 | -0.103 |
| 0.2295028982055629 | 0.901 |
| 0.0895162132404943 | 0.189 |
| -0.32363172077298863 | -0.285 |
| -0.17074735895300686 | -0.949 |
| -0.4480601998059772 | 0.378 |
| -0.01312829351963929 | 0.697 |
| -0.986013692552705 | 0.046 |
| -0.6467420184226755 | -0.512 |
| -0.27890052186710057 | -0.845 |
| -0.1540952566837459 | -0.523 |
| 0.0 | 0 |
| 0.010871205356760116 | 0.635 |
| 0.32388601987097454 | 0.462 |
| 0.6073180901698101 | -0.366 |
| 0.5625673537406706 | -0.213 |
| 0.0 | 0 |
| 0.31650212404836964 | 0.424 |
| -0.813420795657509 | -0.202 |
| -0.5982195335811806 | -0.333 |
| -0.5103115103944236 | -0.621 |
| -0.4331704951758226 | -0.27 |
| 0.789898897868567 | -0.559 |
| -0.6105253116041878 | 0.649 |
| 0.0 | 0 |
| 0.0 | 0 |
| 0.0 | 0 |
| 0.0 | 0 |
| 0.38588120975353557 | 0.271 |
| -0.058964316538011596 | -0.592 |
| 0.05629571908699327 | -0.655 |
| 0.6586757572446207 | 0.467 |
| -0.7274853636512999 | -0.161 |
| -0.6935708051242122 | 0.004 |
| -0.3225385463503576 | 0.409 |
| -0.548415813717243 | -0.098 |
| -0.16763883942136193 | -0.265 |
| 0.34660023708115784 | -0.017 |
| 0.0 | 0 |
| -0.6381377294838151 | 0.068 |
| -0.0015603784718147828 | -0.293 |
| 0.0 | 0 |
| 0.3458824436991179 | 0.675 |
| -0.6581461208790687 | 0.571 |
| -0.1287953368291499 | 0.745 |
| -0.06848274326811232 | 0.85 |
| 0.0 | 0 |
| -0.6951890858529373 | -0.533 |
| 0.7960228480816041 | -0.142 |
| 0.0 | 0 |
| 0.5581673398804947 | -0.679 |
| -0.06737632868280752 | 0.935 |
| 0.3227335440179486 | -0.461 |
| -0.7623621982261777 | 0.402 |
| -0.042163933235568996 | 0.785 |
| -0.4468354453278509 | -0.527 |
| 0.0 | 0 |
| 0.5977043997309588 | -0.697 |
| 0.27819017938443436 | -0.753 |
| -0.43916569037824527 | -0.752 |
| -0.8433523460747643 | -0.537 |
| -0.3163045018025876 | 0.447 |
| 0.22901343130929463 | 0.794 |
| 0.0 | 0 |
| 0.3668814689964208 | 0.184 |
| 0.0 | 0 |
| -0.12912348600763268 | 0.328 |
| 0.6646709456626532 | -0.638 |
| 0.5105426103729307 | -0.555 |
| 0.20151318268014928 | -0.677 |
| -0.2800375756293292 | 0.474 |
| -0.6068793591655 | 0.512 |
| -0.65903066264501 | -0.138 |
| 0.0 | 0 |
| 0.35668415289254285 | -0.852 |
| 0.0 | 0 |
| 0.0 | 0 |
| 0.5737738516768152 | -0.006 |
| 0.32406104089652077 | 0.925 |
| 0.09333508531430867 | -0.434 |
| -0.2389464599897324 | -0.805 |
| -0.5064172136336669 | 0.841 |
| 0.0 | 0 |
| -0.17457739660911198 | -0.912 |
| -0.023393359381983503 | 0.87 |
| 0.0 | 0 |
| -0.160665243069831 | -0.702 |
| -0.7425533739880399 | -0.03 |
| -0.5188958958832177 | 0.348 |
| 0.26122819283056065 | -0.779 |
| -0.5785403736398886 | 0.489 |
| -0.5347611124901388 | -0.627 |
| -0.13246335654167884 | 0.158 |
| -0.1391609693327751 | -0.902 |
| 0.0 | 0 |
| -0.8578114225582951 | 0.459 |
| 0.0 | 0 |
| 0.0 | 0 |
| 0.0 | 0 |
| 0.3092149022511592 | -0.347 |
| 0.354258813915046 | 0.233 |
| -0.13176208674039835 | -0.269 |
| 0.0 | 0 |
| -0.8595730110496806 | 0.505 |
| 0.0 | 0 |
| 0.6999833983931529 | -0.38 |
| 0.43695378010387964 | -0.499 |
| 0.2388880032268592 | -0.961 |
| 0.4593469890313746 | 0.588 |
| -0.8458681395509653 | 0.096 |
| 0.07216348466881572 | 0.642 |
| 0.0 | 0 |
| 0.1829903493603835 | 0.956 |
| 0.0 | 0 |
| 0.0 | 0 |
| 0.8238828982576605 | -0.249 |
| 0.05063178647851663 | 0.062 |
| -0.11562877891223189 | 0.985 |
| -0.24764723252876863 | -0.048 |
| -0.8956930084899604 | 0.41 |
| 0.0 | 0 |
| -0.062432828895827575 | -0.203 |
| 0.0 | 0 |
| -0.39666468397103993 | -0.267 |
| 0.14357087516593636 | -0.646 |
| 0.0 | 0 |
| -0.7489155772746563 | 0.373 |
| 0.0 | 0 |
| 0.0 | 0 |
| 0.6085019854228335 | 0.57 |
| -0.3272514406809879 | -0.375 |
| 0.0 | 0 |
| -0.4498687326907673 | -0.512 |
| 0.5769456299408247 | -0.789 |
| -0.32844270148102805 | 0.572 |
| 0.031178051245582816 | 0.633 |
| 0.5956459006132881 | 0.62 |
| -0.3684452089175101 | -0.526 |
| -0.8597651584116335 | -0.174 |
| -0.599512431156265 | -0.557 |
| 0.0 | 0 |
| 0.0 | 0 |
| 0.0 | 0 |
| -0.36539713478351854 | -0.619 |
| 0.6807744603567152 | -0.057 |
| 0.5644765224023998 | 0.317 |
| -0.08784414197279267 | 0.474 |
| 0.0 | 0 |
| 0.0 | 0 |
| -0.7647268964019851 | 0.14 |
| 0.0 | 0 |
| 0.8162770648445394 | 0.473 |
| 0.6358389066033199 | -0.336 |
| 0.008017816705627956 | -0.278 |
| -0.3443008121522648 | -0.156 |
| 0.34932813420182485 | 0.708 |
| 0.0 | 0 |
| 0.0 | 0 |
| 0.0 | 0 |
| -0.06419463269347014 | -0.321 |
| 0.5255992217149024 | 0.64 |
| -0.11229578251189021 | -0.492 |
| 0.7990862933585607 | -0.041 |
| -0.6211503916719545 | -0.475 |
| -0.7586667788119161 | 0.299 |
| -0.3482714236453799 | 0.689 |
| 0.6067518543230734 | -0.53 |
| 0.7595106312961544 | 0.546 |
| -0.29163774788994745 | 0.666 |
| -0.818308334086288 | 0.179 |
| 0.0 | 0 |
| -0.05690380859102362 | -0.809 |
| -0.5676670340621386 | -0.699 |
| 0.44916497958292956 | 0.213 |
| 0.0 | 0 |
| 0.0 | 0 |
| -0.8753695644836017 | -0.341 |
| 0.0 | 0 |
| -0.06959125568095081 | 0.095 |
| 0.0 | 0 |
| 0.0 | 0 |
| -0.14698052786109161 | -0.31 |
| -0.5233761096589189 | -0.367 |
| 0.0 | 0 |
| -0.37309972909882205 | -0.503 |
| -0.33201118821022124 | -0.075 |
| 0.6856185126955934 | -0.083 |
| 0.31042862032851115 | -0.496 |
| 0.0 | 0 |
| -0.06370630063429816 | -0.995 |
| 0.0 | 0 |
| 0.19697900279986036 | 0.23 |
| 0.15396648321539352 | 0.622 |
| 0.1737850413538815 | -0.459 |
| 0.2193824610404045 | 0.305 |
| -0.847422706816074 | -0.063 |
| 0.6222172569179762 | -0.691 |
| 0.0 | 0 |
| 0.7612191135815105 | -0.489 |
| -0.2100031113942471 | 0.095 |
| 0.2809117059704238 | -0.781 |
| 0.6689981370246878 | -0.095 |
| 0.3429714803326902 | 0.738 |
| -0.06951043889292907 | 0.533 |
| -0.6644269865735675 | -0.483 |
| 0.0 | 0 |
| -0.2134534932282668 | -0.077 |
| 0.3059637910183426 | 0.657 |
| 0.36547742445787956 | 0.895 |
| 0.0 | 0 |
| 0.5622413875479588 | -0.273 |
| -0.4303193501929108 | 0.522 |
| 0.6994235797359218 | 0.693 |
| 0.9455983101475998 | 0.109 |
| -0.6281641595414111 | 0.194 |
| 0.7725363942823493 | 0.327 |
| 0.5784483236087272 | 0.094 |
| 0.9475255006338197 | -0.285 |
| 0.7428772547298252 | 0.476 |
| -0.6338463696159504 | 0.318 |
| 0.5132841612160568 | -0.517 |
| 0.81717271127979 | 0.522 |
| 0.4859953457218007 | 0.115 |
| 0.6554974579839135 | 0.056 |
| 0.2528263483572537 | -0.777 |
| 0.1432720088145294 | -0.344 |
| 0.16605960652737273 | -0.586 |
| 0.637445353333751 | 0.657 |
| 0.0 | 0 |
| 0.6139998921711578 | -0.476 |
| 0.022062604092169202 | 0.048 |
| -0.5355286919433357 | -0.371 |
| 0.005778567618817343 | -0.196 |
| -0.38911463118700906 | -0.211 |
| -0.3287517523804202 | -0.925 |
| 0.19067360795108423 | 0.678 |
| 0.13096879350109703 | 0.057 |
| 0.0 | 0 |
| 0.7262214161682952 | 0.18 |
| -0.8828422750497673 | 0.071 |
| 0.0 | 0 |
| 0.0 | 0 |
| 0.0 | 0 |
| -0.4801294939785039 | -0.335 |
| 0.6971750123550895 | -0.243 |
| -0.5083943055608551 | -0.624 |
| 0.0 | 0 |
| -0.7289089399710951 | 0.421 |
| 0.33013193534690366 | 0.629 |
| 0.5811521975842318 | 0.544 |
| -0.44921507957108964 | 0.236 |
| 0.46838449043629105 | -0.094 |
| 0.1497086991967611 | 0.674 |
| 0.0 | 0 |
| 0.0 | 0 |
| -0.6814264356179303 | 0.599 |
| -0.09177121293354129 | -0.899 |
| 0.0 | 0 |
| 0.06326446305839895 | 0.91 |
| 0.0 | 0 |
| -0.7656209793671267 | 0.058 |
| -0.48919056308348075 | 0.177 |
| -0.3166648526339042 | 0.329 |
| -0.375656299767853 | -0.475 |
| 0.0 | 0 |
| -0.674661180151717 | -0.005 |
| 0.7930307155231993 | -0.1 |
| 0.4368814898943978 | 0.85 |
| -0.7661531364506273 | -0.021 |
| -0.0406543138590747 | -0.06 |
| 0.0 | 0 |
| 0.08890978695687957 | 0.516 |
| -0.21488084620090908 | 0.26 |
| -0.34343175774664236 | -0.335 |
| 0.5891454203424229 | -0.325 |
| -0.22606298502636868 | -0.766 |
| -0.4180607196063526 | 0.019 |
| 0.0 | 0 |
| 0.10262485794159049 | 0.862 |
| 0.0 | 0 |
| 0.48033694013851314 | 0.823 |
| 0.0 | 0 |
| -0.5979796059486475 | -0.652 |
| -0.6305579478231984 | -0.331 |
| -0.269773919172279 | 0.921 |
| -0.6233717753850452 | 0.472 |
| 0.12494769648920889 | -0.467 |
| 0.0 | 0 |
| -0.5722617865313651 | 0.225 |
| -0.7018848454805364 | -0.578 |
| -0.5480016146548836 | 0.257 |
| 0.012690196750005933 | 0.731 |
| -0.46660331867268323 | 0.547 |
| -0.45791250072932277 | 0.047 |
| 0.272645830987851 | 0.903 |
| -0.6762950966416388 | -0.327 |
| -0.39007685162276085 | -0.497 |
| 0.35889274764255186 | -0.049 |
| 0.5745689292789238 | -0.492 |
| -0.2329014668261573 | -0.92 |
| 0.9903888679971213 | 0.004 |
| -0.7759028372373098 | -0.057 |
| 0.9450524331247667 | 0.238 |
| 0.13229102294862316 | 0.897 |
| 0.0 | 0 |
| 0.5484023823273698 | -0.743 |
| -0.6195373446067645 | -0.44 |
| 0.9237032554201321 | 0.144 |
| 0.0 | 0 |
| 0.0 | 0 |
| 0.0 | 0 |
| -0.06267324596600932 | -0.307 |
| -0.11631001450191514 | -0.932 |
| 0.0 | 0 |
| 0.07173709262622929 | -0.595 |
| 0.1496546268343073 | -0.723 |
| 0.10820350457234795 | -0.219 |
| -0.22463697319561216 | -0.504 |
| -0.5624625281792792 | 0.636 |
| 0.5580024787473374 | -0.098 |
| 0.0 | 0 |
| 0.0 | 0 |
| -0.8253709276996628 | -0.044 |
| -0.4889388978933067 | -0.451 |
| 0.4774080552267812 | -0.092 |
| 0.0 | 0 |
| -0.6779021050512661 | -0.34 |
| -0.7959197803299434 | 0.134 |
| 0.0 | 0 |
| -0.08243112829461707 | -0.996 |
| -0.23732694505600382 | 0.042 |
| 0.6054124075603777 | -0.387 |
| -0.530917279187098 | 0.113 |
| -0.38140420131638786 | -0.191 |
| -0.606093384241128 | -0.146 |
| 0.583955680293933 | -0.142 |
| 0.5800130082609107 | -0.126 |
| 0.9166193644846432 | 0.34 |
| 0.38646889443692944 | -0.622 |
| 0.8088108945336541 | -0.214 |
| -0.15164763539362114 | 0.419 |
| -0.2643806473138419 | 0.046 |
| 0.42781839231987995 | -0.391 |
| 0.06812160906135079 | -0.07 |
| 0.3070155554619809 | -0.42 |
| 0.7168856342079055 | 0.665 |
| -0.3495617753171232 | -0.412 |
| -0.504225874265394 | -0.439 |
| 0.0 | 0 |
| 0.5625976662761327 | 0.477 |
| 0.37667651509448463 | -0.002 |
| -0.4564773994616107 | 0.56 |
| -0.25511434750321915 | -0.482 |
| 0.04952881384577146 | -0.187 |
| 0.19888479548903804 | 0.814 |
| 0.13130847550385472 | 0.393 |
| 0.2237089997169417 | -0.597 |
| 0.0 | 0 |
| 0.8226498160855427 | 0.461 |
| 0.2903839331941436 | 0.72 |
| -0.7396390894261882 | 0.05 |
| 0.49467474098072484 | 0.703 |
| -0.5707566774855675 | -0.739 |
| -0.22702622059816924 | -0.919 |
| 0.9292940089393056 | -0.241 |
| 0.0 | 0 |
| 0.0 | 0 |
| -0.09573040311564252 | -0.434 |
| -0.8511809340921446 | 0.411 |
| 0.4363337118893087 | 0.436 |
| 0.188879307242799 | -0.458 |
| -0.7182557179022209 | -0.517 |
| -0.5785643443701021 | -0.385 |
| -0.2030152746911471 | 0.776 |
| 0.1482295178262747 | 0.912 |
| -0.5598149883874877 | 0.241 |
| 0.2631472658425462 | -0.094 |
| 0.5374110626780582 | 0.143 |
| 0.5337144106394704 | 0.315 |
| 0.0 | 0 |
| -0.47435545340697716 | -0.134 |
| -0.0827242968616162 | 0.256 |
| 0.6094827871347674 | 0.361 |
| 0.6428960743916459 | 0.188 |
| 0.0 | 0 |
| 0.0 | 0 |
| -0.20329368427336525 | 0.644 |
| 0.0 | 0 |
| 0.0 | 0 |
| 0.0 | 0 |
| 0.24666309777825424 | 0.254 |
| -0.024175208055925657 | 0.995 |
| 0.6443832345450953 | 0.609 |
| -0.3093544416380676 | -0.591 |
| -0.06492118455628315 | 0.08 |
| 0.0 | 0 |
| -0.3142426293952092 | 0.556 |
| 0.0 | 0 |
| 0.3716480475047088 | 0.363 |
| -0.8470550611118357 | 0.35 |
| 0.0 | 0 |
| 0.003640783226558808 | 0.037 |
| 0.7672996778776191 | 0.514 |
| 0.6866961549012802 | 0.187 |
| -0.6655643304720342 | 0.288 |
| 0.4180115321845759 | -0.216 |
| -0.24089930425671136 | -0.325 |
| 0.0 | 0 |
| -0.6031690307182029 | -0.356 |
| 0.3890780902168893 | 0.207 |
| 0.8671531413555784 | 0.296 |
| 0.0 | 0 |
| 0.21912362622347703 | -0.107 |
| 0.3222856081272818 | -0.306 |
| -0.00636254124933866 | -0.01 |
| 0.4809533294094206 | 0.227 |
| -0.575167122053363 | 0.741 |
| -0.07544744842065043 | -0.02 |
| -0.5493499841331841 | 0.489 |
| 0.0 | 0 |
| 0.0 | 0 |
| 0.0 | 0 |
| 0.18691582548733998 | -0.574 |
| -0.34797762635456575 | -0.16 |
| 0.5522343080515546 | 0.815 |
| 0.0 | 0 |
| -0.201448437514816 | 0.067 |
| -0.8905929782782069 | 0.123 |
| 0.1784357247083581 | -0.011 |
| -0.2908407954333794 | -0.44 |
| 0.09202512774972593 | 0.28 |
| 0.0 | 0 |
| -0.05305872375743781 | -0.082 |
| 0.06714518376870848 | -0.748 |
| 0.7531063439167021 | 0.627 |
| 0.598227755762403 | 0.722 |
| -0.414200841443892 | 0.216 |
| 0.26135073551152543 | -0.162 |
| -0.3011506107565469 | -0.083 |
| -0.07980257339012309 | 0.356 |
| 0.3830435232900491 | -0.237 |
| -0.3820229717428092 | 0.77 |
| -0.06067232149069146 | 0.82 |
| 0.0 | 0 |
| -0.9132176869919295 | 0.388 |
| -0.21366761726448646 | -0.956 |
| 0.0 | 0 |
| -0.009848919881430218 | 0.907 |
| 0.7460310968683916 | -0.404 |
| 0.3815872266287288 | -0.174 |
| 0.0 | 0 |
| 0.0 | 0 |
| 0.34480976502594096 | -0.258 |
| 0.0 | 0 |
| -0.07663037946467743 | -0.963 |
| 0.0 | 0 |
| 0.2343555018949417 | 0.732 |
| 0.6925780742991496 | 0.44 |
| 0.49198679623155206 | -0.85 |
| 0.1377332672824816 | -0.351 |
| -0.35866170499576655 | 0.619 |
| 0.4214553974775319 | 0.677 |
| -0.9005044532117386 | -0.277 |
| -0.7424155439499245 | -0.216 |
| 0.0 | 0 |
| -0.7658317612272945 | 0.569 |
| -0.5790668635014562 | -0.019 |
| -0.048047273546334646 | -0.157 |
| 0.5351497492523336 | -0.74 |
| -0.08414970082508777 | -0.602 |
| 0.33958934775869354 | 0.109 |
| 0.46186084394174 | 0.644 |
| -0.42868627137150317 | -0.791 |
| 0.5583523039978731 | 0.138 |
| 0.9592548147938726 | 0.192 |
| 0.4120906033733476 | 0.34 |
| 0.4218497118250022 | 0.694 |
| 0.8535166754500252 | -0.159 |
| 0.0 | 0 |
| 0.555834621850563 | 0.26 |
| -0.7068488497686027 | 0.505 |
| -0.42429887499026053 | 0.099 |
| 0.3303133629045272 | -0.224 |
| 0.17871353468059725 | 0.69 |
| 0.3885587374662831 | -0.907 |
| 0.0 | 0 |
| -0.10548766282936306 | 0.013 |
| 0.3400112724039477 | -0.558 |
| 0.858411366153818 | -0.1 |
| 0.20213563240400112 | -0.332 |
| 0.0590753429914701 | -0.207 |
| 0.022107418022831116 | -0.959 |
| 0.5487081721731528 | -0.386 |
| 0.5231977642225178 | -0.476 |
| -0.4039940080031075 | 0.549 |
| 0.0 | 0 |
| -0.8899509619189832 | -0.374 |
| -0.42586795047159853 | 0.197 |
| 0.506983265532972 | -0.63 |
| 0.04374312278108827 | -0.413 |
| -0.008091949168190338 | 0.589 |
| -0.7198644168243016 | 0.156 |
| 0.25259037528142936 | 0.167 |
| 0.6741885342565399 | 0.451 |
| 0.0 | 0 |
| -0.12669441035337559 | 0.676 |
| 0.29543333801077365 | -0.836 |
| -0.7379351609700497 | -0.128 |
| -0.1362749398166767 | 0.818 |
| -0.25296523743443955 | -0.389 |
| -0.36833351027104455 | -0.289 |
| -0.3901442360571472 | 0.162 |
| -0.14930619013819624 | 0.849 |
| 0.0 | 0 |
| -0.5187875541557381 | -0.583 |
| -0.7161403151227899 | -0.013 |
| 0.0 | 0 |
| 0.0 | 0 |
| 0.0 | 0 |
| 0.9357954696005182 | 0.258 |
| -0.3018873313056709 | -0.38 |
| 0.19651370937685564 | -0.148 |
| 0.15171308043559328 | 0.898 |
| 0.17906741703178608 | 0.894 |
| 0.4332121624225216 | -0.028 |
| -0.652479748258205 | 0.599 |
| 0.3592197908435846 | 0.426 |
| -0.07447486986753682 | -0.212 |
| 0.09315162521658449 | 0.34 |
| -0.6788754110619373 | 0.13 |
| 0.443422977759506 | -0.035 |
| -0.5979886306624971 | -0.472 |
| 0.12766889144059124 | 0.101 |
| -0.7408951215456729 | 0.649 |
| 0.7866595337537889 | -0.319 |
| 0.024032603868152647 | 0.307 |
| 0.43809599571630686 | 0.739 |
| 0.4141231263291816 | -0.049 |
| 0.03632858730788535 | 0.448 |
| -0.634747993405764 | 0.345 |
| -0.14784068345349288 | 0.619 |
| -0.6174122178398529 | -0.465 |
| -0.6152851477927646 | 0.701 |
| -0.008765956421147969 | -0.283 |
| -0.6571649297476181 | -0.267 |
| 0.24332821441680297 | 0.515 |
| -0.898295251675892 | 0.384 |
| 0.8272661036094813 | -0.253 |
| 0.48835644933137834 | -0.326 |
| 0.0 | 0 |
| -0.3632067926204152 | -0.588 |
| 0.019358435850008293 | -0.402 |
| -0.13161710223586165 | -0.924 |
| 0.0 | 0 |
| 0.0 | 0 |
| -0.6767871331519457 | -0.342 |
| 0.0 | 0 |
| -0.3344184456287709 | -0.757 |
| -0.031843660888221104 | -0.305 |
| 0.252085830803622 | 0.806 |
| 0.7894621774628294 | 0.112 |
| 0.0 | 0 |
| 0.25657628436264757 | -0.353 |
| -0.8779409805764702 | -0.122 |
| -0.36487958959571487 | -0.333 |
| -0.5015551154093552 | 0.691 |
| 0.0 | 0 |
| 0.0 | 0 |
| 0.8812737250444858 | -0.339 |
| -0.6184429321736995 | -0.566 |
| -0.5785390411278515 | -0.079 |
| 0.0 | 0 |
| -0.8068070042437254 | -0.525 |
| 0.0 | 0 |
| -0.8981868701150149 | 0.395 |
| 0.23551050825554398 | 0.922 |
| -0.5530997258514192 | 0.34 |
| 0.12652739732376928 | -0.272 |
| -0.6854476320031784 | -0.624 |
| -0.9618372192919884 | 0.102 |
| 0.4461140616745338 | 0.371 |
| -0.5432166178372808 | -0.517 |
| -0.8666785735862521 | -0.416 |
| -0.9655694183185803 | -0.16 |
| 0.4418407261070898 | -0.729 |
| 0.5147350399506321 | 0.748 |
| -0.28108819890151726 | 0.897 |
| 0.2155889851032513 | 0.118 |
| 0.25072357869076667 | 0.727 |
| 0.5869321218777561 | -0.708 |
| -0.47755716868113374 | 0.619 |
| 0.0 | 0 |
| 0.0 | 0 |
| -0.7334760961263134 | -0.359 |
| 0.0 | 0 |
| 0.08908229757224517 | -0.996 |
| 0.0 | 0 |
| -0.15010194850920655 | 0.236 |
| -0.2625679951749431 | -0.32 |
| -0.08750235375293336 | 0.931 |
| 0.0 | 0 |
| 0.3038740830628057 | -0.582 |
| 0.0 | 0 |
| -0.46114709783495766 | -0.548 |
| 0.20837175646284045 | -0.241 |
| -0.5596811133389825 | -0.623 |
| 0.0 | 0 |
| -0.007315558172724668 | 0.75 |
| -0.03344794389710448 | -0.855 |
| 0.7200113827698287 | -0.649 |
| -0.23815589132973658 | -0.281 |
| 0.0 | 0 |
| -0.10415764696519103 | -0.516 |
| 0.01232253169514963 | 0.084 |
| -0.166971023970794 | -0.441 |
| 0.6541374708087777 | 0.368 |
| 0.27616883861739683 | 0.537 |
| 0.10017796607044738 | 0.239 |
| 0.14556610168259354 | -0.479 |
| 0.00010517817190169865 | -0.861 |
| -0.09257021238820595 | -0.082 |
| 0.29731778603816394 | -0.398 |
| 0.4832919365241479 | 0.037 |
| 0.41258260088281085 | -0.838 |
| -0.2210156947709001 | -0.203 |
| 0.02599010060124618 | 0.337 |
| 0.0 | 0 |
| -0.6151661264342232 | -0.279 |
| 0.5039522112605461 | 0.138 |
| 0.0 | 0 |
| 0.0 | 0 |
| 0.6793034039516554 | 0.486 |
| -0.643862818642863 | 0.078 |
| 0.0 | 0 |
| 0.04205019317058767 | -0.691 |
| 0.0 | 0 |
| 0.0 | 0 |
| -0.7102895474058526 | 0.111 |
| 0.5516489692935826 | -0.821 |
| 0.0 | 0 |
| -0.0024927557636507114 | 0.189 |
| 0.11888023604128484 | 0.505 |
| -0.7727827921582768 | -0.054 |
| 0.10602231982636723 | -0.271 |
| 0.8616508098744589 | 0.506 |
| 0.528587588400528 | 0.717 |
| -0.3658219304928796 | 0.57 |
| -0.08249568808621577 | -0.214 |
| 0.09954560071838858 | -0.837 |
| -0.03756190428087125 | -0.906 |
| 0.0 | 0 |
| -0.19735090807142064 | -0.478 |
| 0.4333590096513773 | 0.476 |
| 0.0 | 0 |
| -0.8324158289082533 | 0.427 |
| 0.36766223975388046 | -0.531 |
| 0.0 | 0 |
| 0.0 | 0 |
| 0.4007783801279168 | 0.747 |
| -0.7643907421190195 | 0.477 |
| 0.44665084522981635 | 0.03 |
| -0.5382954677835656 | 0.254 |
| 0.0 | 0 |
| -0.7479728131442256 | -0.2 |
| -0.6578779898705467 | 0.521 |
| 0.12468995521916293 | 0.704 |
| 0.5412846164556451 | 0.142 |
| 0.7895905046717535 | 0.038 |
| -0.2845302591599781 | -0.956 |
| 0.10634940084579525 | -0.078 |
| 0.7009902291698997 | 0.036 |
| 0.0 | 0 |
| 0.0 | 0 |
| 0.42093714407978156 | -0.616 |
| 0.06321720518574447 | 0.783 |
| 0.0 | 0 |
| 0.0 | 0 |
| -0.01232577407066282 | 0.534 |
| -0.7952373688440808 | -0.302 |
| -0.3364795364938846 | 0.424 |
| -0.7648265677553576 | 0.049 |
| -0.23274213806260202 | -0.096 |
| -0.5141159305367489 | 0.402 |
| 0.3949572290923695 | -0.487 |
| -0.9152354917658083 | 0.196 |
| -0.0725846418922389 | -0.601 |
| -0.06687824570113987 | 0.633 |
| 0.12514934758666119 | -0.228 |
| 0.15503133128368818 | -0.965 |
| -0.02108483080672885 | -0.873 |
| 0.0 | 0 |
| -0.6045810799545339 | 0.067 |
| -0.6803649925745565 | 0.12 |
| 0.0 | 0 |
| 0.926439208196532 | 0.346 |
| 0.0 | 0 |
| 0.46998994586818754 | 0.535 |
| -0.5222215910798933 | -0.261 |
| 0.16413201047427828 | -0.19 |
| 0.7010883360079352 | 0.346 |
| -0.8060978979367683 | -0.481 |
| 0.6367402677933764 | -0.532 |
| 0.05605172157433702 | -0.669 |
| 0.1419967843838985 | 0.08 |
| -0.589779670229706 | -0.263 |
| -0.2106125927061553 | 0.519 |
| 0.5907364202428786 | 0.454 |
| -0.585969450622005 | 0.611 |
| 0.0 | 0 |
| -0.3463456504085214 | -0.064 |
| 0.6530351263591143 | -0.407 |
| 0.41352978804970486 | -0.315 |
| 0.0 | 0 |
| 0.08433389737209862 | -0.938 |
| -0.8216329996355918 | 0.239 |
| 0.0 | 0 |
| -0.7398820031361764 | -0.281 |
| 0.0 | 0 |
| 0.5383487786908652 | -0.115 |
| -0.9090149947404029 | -0.004 |
| -0.11224769051695915 | -0.552 |
| 0.7447850752573817 | 0.071 |
| -0.588808564216051 | 0.146 |
| 0.2869253932974314 | 0.295 |
| -0.12764150750055792 | -0.63 |
| -0.7177226068556917 | 0.215 |
| 0.0 | 0 |
| -0.7227888227825363 | 0.197 |
| -0.6385407003574324 | 0.111 |
| -0.2147364723013836 | 0.164 |
| 0.0 | 0 |
| -0.19742554890424313 | 0.415 |
| 0.41786233732568023 | 0.36 |
| -0.3266821884468596 | -0.785 |
| 0.9448456781246601 | 0.325 |
| -0.05355138778099633 | -0.504 |
| 0.8805070152435679 | -0.386 |
| 0.2379598196613335 | -0.4 |
| -0.6667525054750312 | -0.27 |
| 0.2537629348307433 | -0.537 |
| -0.19232690138689712 | 0.955 |
| -0.6151879184124407 | 0.575 |
| -0.8222617342873533 | -0.351 |
| 0.6603211885293923 | 0.012 |
| -0.16499769137219866 | -0.267 |
| 0.43291050885102256 | -0.784 |
| -0.4219578984974883 | 0.659 |
| 0.0 | 0 |
| 0.0019753910291682164 | 0.561 |
| 0.7569791349846207 | -0.187 |
| 0.0957439966043303 | 0.886 |
| 0.9332607995851123 | 0.315 |
| -0.4019419129062034 | -0.241 |
| 0.3219578075299141 | 0.281 |
| 0.577363264102537 | 0.678 |
| -0.5371533344955319 | 0.762 |
| 0.7213557494247889 | 0.375 |
| -0.5405206021932334 | -0.286 |
| 0.9047754645457731 | -0.244 |
| -0.17322955297225406 | -0.941 |
| 0.5542083183914335 | 0.036 |
| 0.7795834617424044 | 0.197 |
| 0.020849831618843906 | 0.864 |
| -0.5572190635992562 | 0.461 |
| -0.29470867762108766 | -0.933 |
| -0.8267528653715672 | 0.476 |
| -0.44725086954657756 | 0.489 |
| 0.0 | 0 |
| 0.08255139291405289 | 0.246 |
| 0.11981361735653784 | 0.313 |
| -0.22999781772533123 | -0.594 |
| 0.8608435170040731 | -0.185 |
| 0.299353275691274 | -0.48 |
| -0.8031713665535636 | 0.048 |
| -0.20296288277904884 | -0.335 |
| 0.0 | 0 |
| 0.0 | 0 |
| 0.5281418467006516 | 0.082 |
| 0.12166572339151749 | -0.115 |
| 0.5739006473582247 | -0.668 |
| -0.7832975963052737 | -0.013 |
| 0.6884931778487484 | 0.204 |
| 0.0 | 0 |
| 0.6818009145915829 | -0.389 |
| 0.0 | 0 |
| 0.7834848554373466 | 0.202 |
| 0.0 | 0 |
| 0.0 | 0 |
| -0.4154588083325996 | -0.038 |
| -0.16260070468004728 | -0.886 |
| 0.22424906960414925 | -0.725 |
| 0.0 | 0 |
| 0.0 | 0 |
| 0.9182207502228812 | -0.046 |
| -0.5591133557094643 | 0.31 |
| -0.13490304267853093 | -0.103 |
| 0.11033797946109702 | 0.389 |
| -0.197528892300745 | -0.369 |
| 0.0 | 0 |
| 0.6350286735313873 | 0.104 |
| -0.22379158421164336 | -0.554 |
| -0.6477248360655277 | -0.515 |
| 0.014025956319364985 | 0.238 |
| 0.7892159391349258 | -0.481 |
| -0.7236356522802656 | -0.004 |
| 0.7426156266149182 | 0.066 |
| -0.3387733623762412 | -0.347 |
| 0.004626145754760502 | -0.462 |
| -0.0006357071191582797 | -0.365 |
| -0.12856233834716102 | -0.523 |
| -0.34585980554946505 | -0.513 |
| -0.8262516279622583 | -0.416 |
| -0.754854436893893 | 0.008 |
| -0.364919496845423 | 0.286 |
| 0.0 | 0 |
| -0.37455230664571904 | -0.79 |
| 0.31758961338112424 | -0.144 |
| 0.0 | 0 |
| -0.627255616284671 | 0.605 |
| -0.0372522867309244 | 0.549 |
| 0.43280341185789895 | -0.574 |
| -0.4426766687789161 | -0.261 |
| -0.26559686107462066 | 0.077 |
| 0.5011902720260459 | 0.132 |
| -0.09193978575211759 | -0.26 |
| -0.4203269976954014 | -0.051 |
| 0.31990624132116174 | 0.822 |
| -0.9450728280962284 | 0.297 |
| 0.0 | 0 |
| 0.0 | 0 |
| 0.2773909051736856 | -0.509 |
| -0.6694429217161313 | 0.259 |
| -0.7188183681681517 | -0.64 |
| -0.35051539828538947 | 0.445 |
| -0.4123896579747204 | 0.149 |
| 0.0 | 0 |
| -0.04057894988762767 | -0.156 |
| 0.4918514299765542 | 0.82 |
| -0.6359923989637661 | 0.648 |
| 0.0 | 0 |
| 0.0 | 0 |
| 0.0 | 0 |
| 0.78693586391714 | -0.235 |
| 0.12916159609064692 | 0.832 |
| -0.5077743662593583 | 0.478 |
| 0.6358961515340553 | 0.705 |
| -0.24130179974740584 | -0.968 |
| 0.0 | 0 |
| 0.030398076130002005 | -0.785 |
| 0.04046126253806448 | -0.67 |
| -0.569605375183798 | -0.12 |
| -0.23102165354983062 | 0.752 |
| -0.76089691798386 | 0.309 |
| 0.0 | 0 |
| 0.3254018066296325 | -0.325 |
| 0.7812963391291354 | -0.285 |
| 0.0 | 0 |
| 0.0 | 0 |
| 0.6507881107200402 | -0.382 |
| -0.11726910395403545 | -0.199 |
| 0.0 | 0 |
| -0.4961369780922662 | -0.454 |
| 0.5646802218531599 | -0.407 |
| 0.0 | 0 |
| 0.19956263726447254 | -0.027 |
| 0.3405957178554455 | 0.075 |
| 0.5604516539686908 | 0.69 |
| 0.0 | 0 |
| 0.36891485968972804 | -0.366 |
| 0.4566298095611627 | 0.239 |